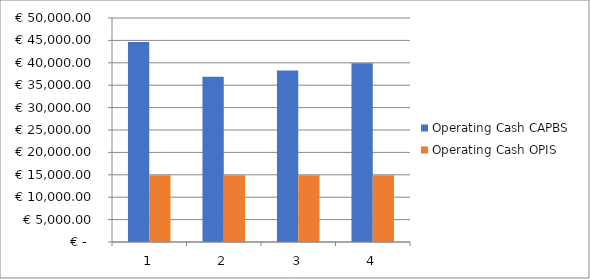
| Category | Operating Cash CAPBS | Operating Cash OPIS |
|---|---|---|
| 0 | 44639.625 | 14924.7 |
| 1 | 36861.129 | 14924.7 |
| 2 | 38304.783 | 14924.7 |
| 3 | 39892.803 | 14924.7 |